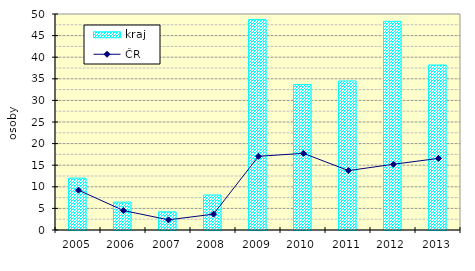
| Category | kraj |
|---|---|
| 2005.0 | 12.007 |
| 2006.0 | 6.458 |
| 2007.0 | 4.201 |
| 2008.0 | 8.088 |
| 2009.0 | 48.753 |
| 2010.0 | 33.663 |
| 2011.0 | 34.505 |
| 2012.0 | 48.294 |
| 2013.0 | 38.196 |